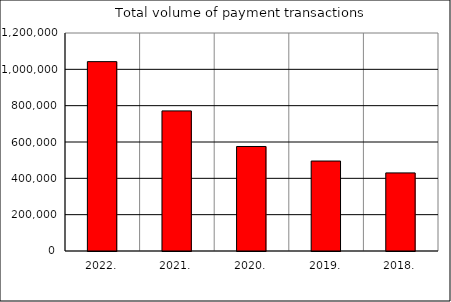
| Category | Total volume of payment transactions |
|---|---|
| 2022. | 1042369 |
| 2021. | 771176 |
| 2020. | 575280 |
| 2019. | 495238 |
| 2018. | 429847 |